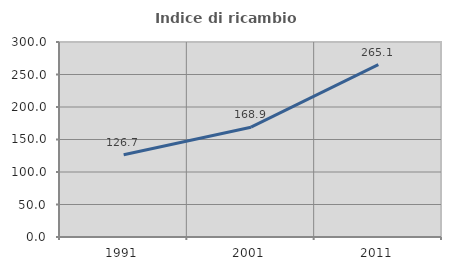
| Category | Indice di ricambio occupazionale  |
|---|---|
| 1991.0 | 126.667 |
| 2001.0 | 168.919 |
| 2011.0 | 265.079 |